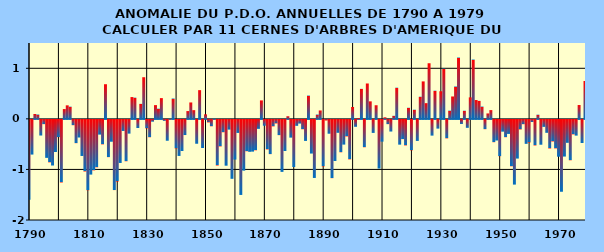
| Category | PDO |
|---|---|
| 1790.0 | -1.58 |
| 1791.0 | -0.686 |
| 1792.0 | 0.096 |
| 1793.0 | 0.086 |
| 1794.0 | -0.31 |
| 1795.0 | -0.085 |
| 1796.0 | -0.751 |
| 1797.0 | -0.84 |
| 1798.0 | -0.903 |
| 1799.0 | -0.636 |
| 1800.0 | -0.342 |
| 1801.0 | -1.238 |
| 1802.0 | 0.193 |
| 1803.0 | 0.267 |
| 1804.0 | 0.241 |
| 1805.0 | -0.106 |
| 1806.0 | -0.461 |
| 1807.0 | -0.349 |
| 1808.0 | -0.714 |
| 1809.0 | -1.021 |
| 1810.0 | -1.392 |
| 1811.0 | -1.082 |
| 1812.0 | -0.998 |
| 1813.0 | -0.938 |
| 1814.0 | -0.291 |
| 1815.0 | -0.485 |
| 1816.0 | 0.685 |
| 1817.0 | -0.737 |
| 1818.0 | -0.432 |
| 1819.0 | -1.389 |
| 1820.0 | -1.219 |
| 1821.0 | -0.852 |
| 1822.0 | -0.22 |
| 1823.0 | -0.819 |
| 1824.0 | -0.272 |
| 1825.0 | 0.431 |
| 1826.0 | 0.419 |
| 1827.0 | -0.161 |
| 1828.0 | 0.296 |
| 1829.0 | 0.823 |
| 1830.0 | -0.168 |
| 1831.0 | -0.344 |
| 1832.0 | -0.036 |
| 1833.0 | 0.272 |
| 1834.0 | 0.201 |
| 1835.0 | 0.41 |
| 1836.0 | -0.02 |
| 1837.0 | -0.413 |
| 1838.0 | 0.004 |
| 1839.0 | 0.402 |
| 1840.0 | -0.564 |
| 1841.0 | -0.713 |
| 1842.0 | -0.616 |
| 1843.0 | -0.301 |
| 1844.0 | 0.154 |
| 1845.0 | 0.324 |
| 1846.0 | 0.172 |
| 1847.0 | -0.472 |
| 1848.0 | 0.568 |
| 1849.0 | -0.556 |
| 1850.0 | 0.089 |
| 1851.0 | -0.051 |
| 1852.0 | -0.127 |
| 1853.0 | 0.006 |
| 1854.0 | -0.902 |
| 1855.0 | -0.525 |
| 1856.0 | -0.245 |
| 1857.0 | -0.906 |
| 1858.0 | -0.193 |
| 1859.0 | -1.166 |
| 1860.0 | -0.785 |
| 1861.0 | -0.258 |
| 1862.0 | -1.485 |
| 1863.0 | -1.004 |
| 1864.0 | -0.62 |
| 1865.0 | -0.632 |
| 1866.0 | -0.628 |
| 1867.0 | -0.602 |
| 1868.0 | -0.178 |
| 1869.0 | 0.365 |
| 1870.0 | -0.115 |
| 1871.0 | -0.584 |
| 1872.0 | -0.678 |
| 1873.0 | -0.129 |
| 1874.0 | -0.071 |
| 1875.0 | -0.302 |
| 1876.0 | -1.028 |
| 1877.0 | -0.616 |
| 1878.0 | 0.052 |
| 1879.0 | -0.351 |
| 1880.0 | -0.932 |
| 1881.0 | -0.118 |
| 1882.0 | -0.074 |
| 1883.0 | -0.186 |
| 1884.0 | -0.416 |
| 1885.0 | 0.46 |
| 1886.0 | -0.666 |
| 1887.0 | -1.149 |
| 1888.0 | 0.085 |
| 1889.0 | 0.166 |
| 1890.0 | -0.92 |
| 1891.0 | -0.012 |
| 1892.0 | -0.274 |
| 1893.0 | -1.153 |
| 1894.0 | -0.814 |
| 1895.0 | -0.256 |
| 1896.0 | -0.641 |
| 1897.0 | -0.489 |
| 1898.0 | -0.328 |
| 1899.0 | -0.782 |
| 1900.0 | 0.234 |
| 1901.0 | -0.137 |
| 1902.0 | 0.013 |
| 1903.0 | 0.593 |
| 1904.0 | -0.542 |
| 1905.0 | 0.699 |
| 1906.0 | 0.346 |
| 1907.0 | -0.258 |
| 1908.0 | 0.269 |
| 1909.0 | -0.963 |
| 1910.0 | -0.431 |
| 1911.0 | 0.03 |
| 1912.0 | -0.085 |
| 1913.0 | -0.231 |
| 1914.0 | 0.06 |
| 1915.0 | 0.616 |
| 1916.0 | -0.49 |
| 1917.0 | -0.381 |
| 1918.0 | -0.505 |
| 1919.0 | 0.219 |
| 1920.0 | -0.602 |
| 1921.0 | 0.181 |
| 1922.0 | -0.416 |
| 1923.0 | 0.438 |
| 1924.0 | 0.741 |
| 1925.0 | 0.31 |
| 1926.0 | 1.1 |
| 1927.0 | -0.312 |
| 1928.0 | 0.557 |
| 1929.0 | -0.173 |
| 1930.0 | 0.545 |
| 1931.0 | 0.993 |
| 1932.0 | -0.366 |
| 1933.0 | 0.163 |
| 1934.0 | 0.442 |
| 1935.0 | 0.64 |
| 1936.0 | 1.212 |
| 1937.0 | -0.081 |
| 1938.0 | 0.161 |
| 1939.0 | -0.157 |
| 1940.0 | 0.425 |
| 1941.0 | 1.173 |
| 1942.0 | 0.372 |
| 1943.0 | 0.356 |
| 1944.0 | 0.243 |
| 1945.0 | -0.184 |
| 1946.0 | 0.107 |
| 1947.0 | 0.173 |
| 1948.0 | -0.442 |
| 1949.0 | -0.408 |
| 1950.0 | -0.719 |
| 1951.0 | -0.233 |
| 1952.0 | -0.343 |
| 1953.0 | -0.278 |
| 1954.0 | -0.918 |
| 1955.0 | -1.28 |
| 1956.0 | -0.766 |
| 1957.0 | -0.19 |
| 1958.0 | -0.086 |
| 1959.0 | -0.474 |
| 1960.0 | -0.447 |
| 1961.0 | -0.043 |
| 1962.0 | -0.506 |
| 1963.0 | 0.083 |
| 1964.0 | -0.492 |
| 1965.0 | -0.138 |
| 1966.0 | -0.256 |
| 1967.0 | -0.566 |
| 1968.0 | -0.427 |
| 1969.0 | -0.564 |
| 1970.0 | -0.728 |
| 1971.0 | -1.422 |
| 1972.0 | -0.726 |
| 1973.0 | -0.454 |
| 1974.0 | -0.799 |
| 1975.0 | -0.287 |
| 1976.0 | -0.312 |
| 1977.0 | 0.273 |
| 1978.0 | -0.458 |
| 1979.0 | 0.749 |